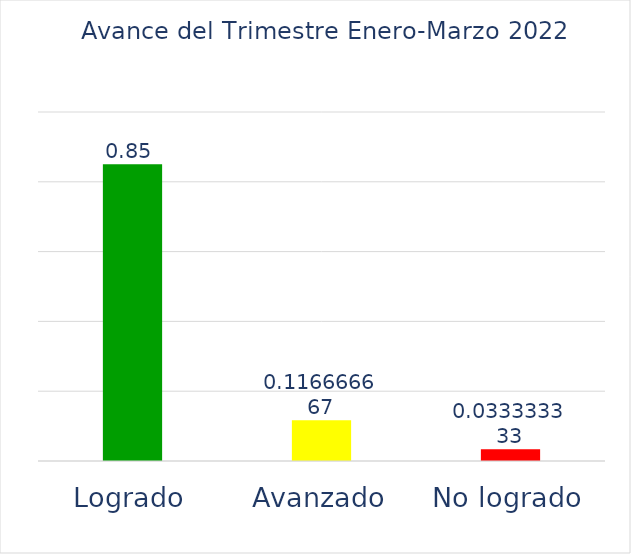
| Category | Series 0 |
|---|---|
| Logrado | 0.85 |
| Avanzado | 0.117 |
| No logrado | 0.033 |